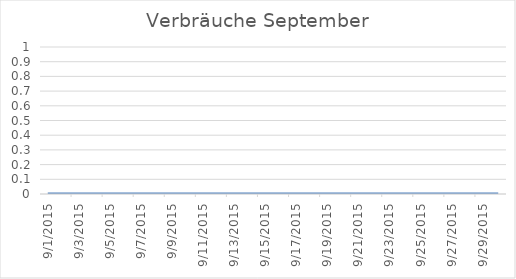
| Category | Series 0 |
|---|---|
| 01/09/2015 | 0 |
| 02/09/2015 | 0 |
| 03/09/2015 | 0 |
| 04/09/2015 | 0 |
| 05/09/2015 | 0 |
| 06/09/2015 | 0 |
| 07/09/2015 | 0 |
| 08/09/2015 | 0 |
| 09/09/2015 | 0 |
| 10/09/2015 | 0 |
| 11/09/2015 | 0 |
| 12/09/2015 | 0 |
| 13/09/2015 | 0 |
| 14/09/2015 | 0 |
| 15/09/2015 | 0 |
| 16/09/2015 | 0 |
| 17/09/2015 | 0 |
| 18/09/2015 | 0 |
| 19/09/2015 | 0 |
| 20/09/2015 | 0 |
| 21/09/2015 | 0 |
| 22/09/2015 | 0 |
| 23/09/2015 | 0 |
| 24/09/2015 | 0 |
| 25/09/2015 | 0 |
| 26/09/2015 | 0 |
| 27/09/2015 | 0 |
| 28/09/2015 | 0 |
| 29/09/2015 | 0 |
| 30/09/2015 | 0 |